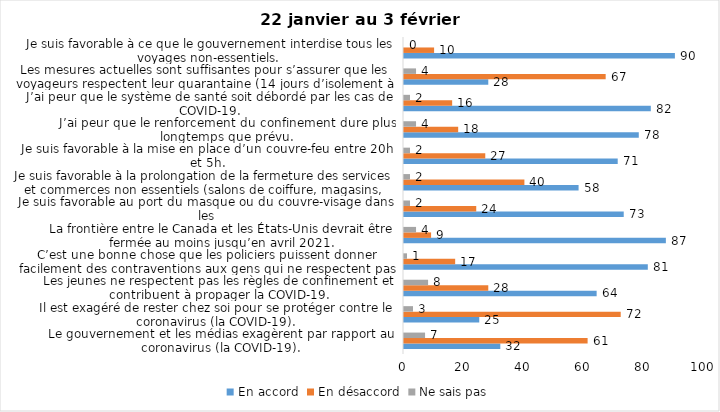
| Category | En accord | En désaccord | Ne sais pas |
|---|---|---|---|
| Le gouvernement et les médias exagèrent par rapport au coronavirus (la COVID-19). | 32 | 61 | 7 |
| Il est exagéré de rester chez soi pour se protéger contre le coronavirus (la COVID-19). | 25 | 72 | 3 |
| Les jeunes ne respectent pas les règles de confinement et contribuent à propager la COVID-19. | 64 | 28 | 8 |
| C’est une bonne chose que les policiers puissent donner facilement des contraventions aux gens qui ne respectent pas les mesures pour prévenir le coronavirus (la COVID-19). | 81 | 17 | 1 |
| La frontière entre le Canada et les États-Unis devrait être fermée au moins jusqu’en avril 2021. | 87 | 9 | 4 |
| Je suis favorable au port du masque ou du couvre-visage dans les
lieux publics extérieurs achalandés (ex. rues, parcs) | 73 | 24 | 2 |
| Je suis favorable à la prolongation de la fermeture des services et commerces non essentiels (salons de coiffure, magasins, industries) jusqu’au 8 février. | 58 | 40 | 2 |
| Je suis favorable à la mise en place d’un couvre-feu entre 20h et 5h. | 71 | 27 | 2 |
| J’ai peur que le renforcement du confinement dure plus longtemps que prévu. | 78 | 18 | 4 |
| J’ai peur que le système de santé soit débordé par les cas de COVID-19. | 82 | 16 | 2 |
| Les mesures actuelles sont suffisantes pour s’assurer que les voyageurs respectent leur quarantaine (14 jours d’isolement à la maison au retour d’un voyage). | 28 | 67 | 4 |
| Je suis favorable à ce que le gouvernement interdise tous les voyages non-essentiels. | 90 | 10 | 0 |